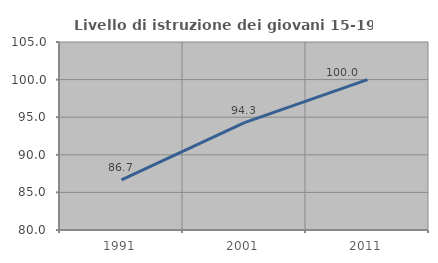
| Category | Livello di istruzione dei giovani 15-19 anni |
|---|---|
| 1991.0 | 86.667 |
| 2001.0 | 94.286 |
| 2011.0 | 100 |